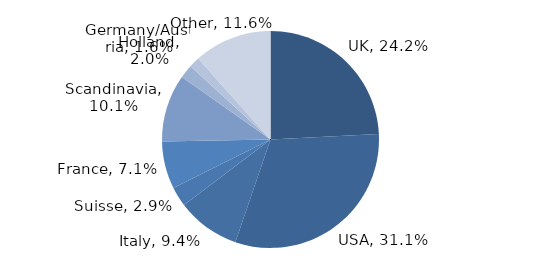
| Category | Investment Style |
|---|---|
| UK | 0.242 |
| USA | 0.311 |
| Italy | 0.094 |
| Suisse | 0.029 |
| France | 0.071 |
| Scandinavia | 0.101 |
| Holland | 0.02 |
| Germany/Austria | 0.016 |
| Other | 0.116 |